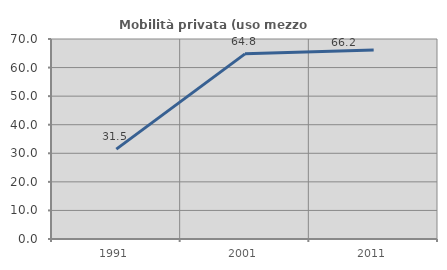
| Category | Mobilità privata (uso mezzo privato) |
|---|---|
| 1991.0 | 31.452 |
| 2001.0 | 64.8 |
| 2011.0 | 66.154 |